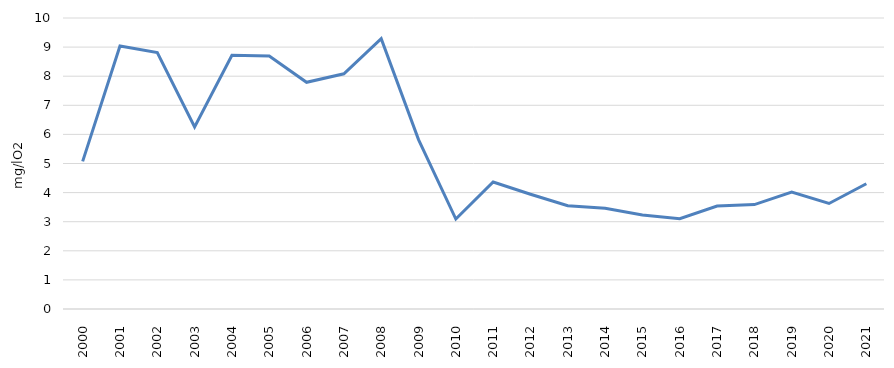
| Category | БПК 5  (mg/lO2) |
|---|---|
| 2000.0 | 5.073 |
| 2001.0 | 9.04 |
| 2002.0 | 8.81 |
| 2003.0 | 6.253 |
| 2004.0 | 8.717 |
| 2005.0 | 8.697 |
| 2006.0 | 7.79 |
| 2007.0 | 8.083 |
| 2008.0 | 9.29 |
| 2009.0 | 5.82 |
| 2010.0 | 3.092 |
| 2011.0 | 4.364 |
| 2012.0 | 3.943 |
| 2013.0 | 3.546 |
| 2014.0 | 3.458 |
| 2015.0 | 3.228 |
| 2016.0 | 3.1 |
| 2017.0 | 3.539 |
| 2018.0 | 3.588 |
| 2019.0 | 4.016 |
| 2020.0 | 3.626 |
| 2021.0 | 4.305 |